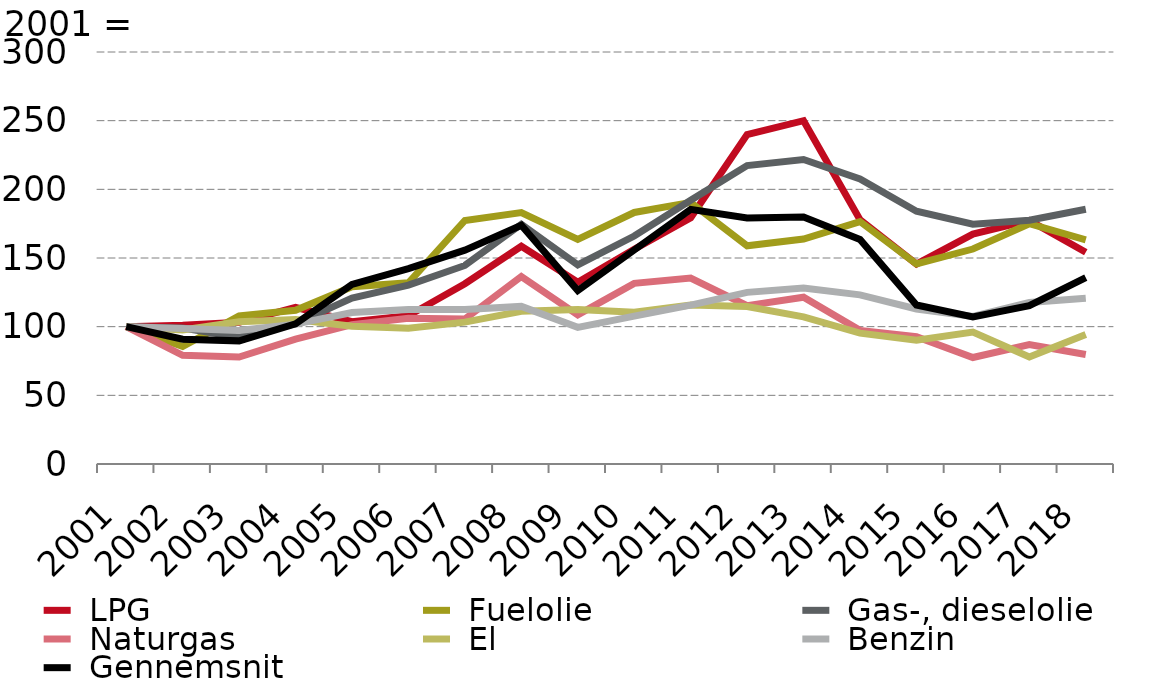
| Category |  LPG |  Fuelolie |  Gas-, dieselolie |  Naturgas |  El |  Benzin |  Gennemsnit |
|---|---|---|---|---|---|---|---|
| 2001.0 | 100 | 100 | 100 | 100 | 100 | 100 | 100 |
| 2002.0 | 101.031 | 85.519 | 99.073 | 79.166 | 97.631 | 98.686 | 90.896 |
| 2003.0 | 103.143 | 107.854 | 92.277 | 77.909 | 103.545 | 97.294 | 89.661 |
| 2004.0 | 114.095 | 111.889 | 102.247 | 90.958 | 105.203 | 101.84 | 102.061 |
| 2005.0 | 103.606 | 129.059 | 120.884 | 101.5 | 100.321 | 110.284 | 130.81 |
| 2006.0 | 107.978 | 131.938 | 130.31 | 106.078 | 98.898 | 112.502 | 142.294 |
| 2007.0 | 131.248 | 177.333 | 144.585 | 105.54 | 103.314 | 112.549 | 155.718 |
| 2008.0 | 158.568 | 183.052 | 174.585 | 136.493 | 111.248 | 114.752 | 173.899 |
| 2009.0 | 132.385 | 163.48 | 145.022 | 108.585 | 112.562 | 99.505 | 126.26 |
| 2010.0 | 156.383 | 183.15 | 166.017 | 131.512 | 110.559 | 107.633 | 155.809 |
| 2011.0 | 179.324 | 190.49 | 192.038 | 135.44 | 115.773 | 115.71 | 185.423 |
| 2012.0 | 239.876 | 158.888 | 217.331 | 115.274 | 114.718 | 124.974 | 179.153 |
| 2013.0 | 249.968 | 163.788 | 221.724 | 121.443 | 107.145 | 128.187 | 179.863 |
| 2014.0 | 177.865 | 176.539 | 207.609 | 97.308 | 95.266 | 123.159 | 163.447 |
| 2015.0 | 145.578 | 145.657 | 184.059 | 92.661 | 90.1 | 112.911 | 115.761 |
| 2016.0 | 167.376 | 156.538 | 174.625 | 77.526 | 96.096 | 107.439 | 107.089 |
| 2017.0 | 177.4 | 174.934 | 177.526 | 86.894 | 77.872 | 117.556 | 115.289 |
| 2018.0 | 154.209 | 163.132 | 185.517 | 79.706 | 94.331 | 120.633 | 135.704 |